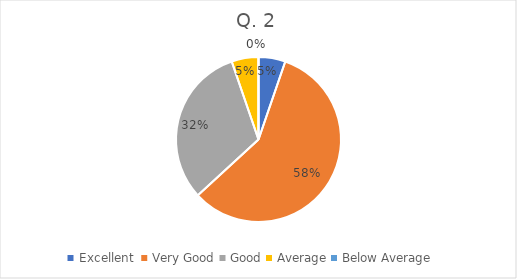
| Category | Series 0 |
|---|---|
| Excellent  | 2 |
| Very Good | 22 |
| Good | 12 |
| Average | 2 |
| Below Average | 0 |